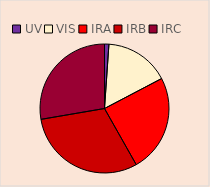
| Category | Series 0 |
|---|---|
| UV | 5467.516 |
| VIS | 80847.894 |
| IRA | 122166.266 |
| IRB | 152026.896 |
| IRC | 138098.251 |